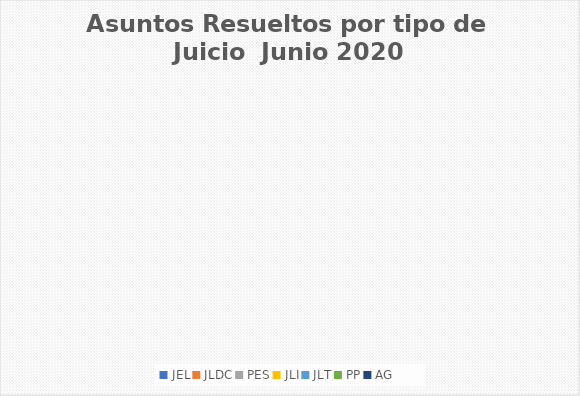
| Category | Asuntos Resueltos por tipo de Juicio  Junio |
|---|---|
| JEL | 0 |
| JLDC | 0 |
| PES | 0 |
| JLI | 0 |
| JLT | 0 |
| PP | 0 |
| AG | 0 |